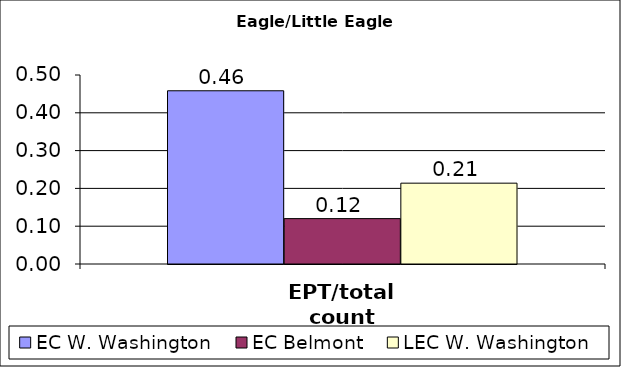
| Category | EC W. Washington | EC Belmont | LEC W. Washington |
|---|---|---|---|
| EPT/total count | 0.458 | 0.12 | 0.214 |